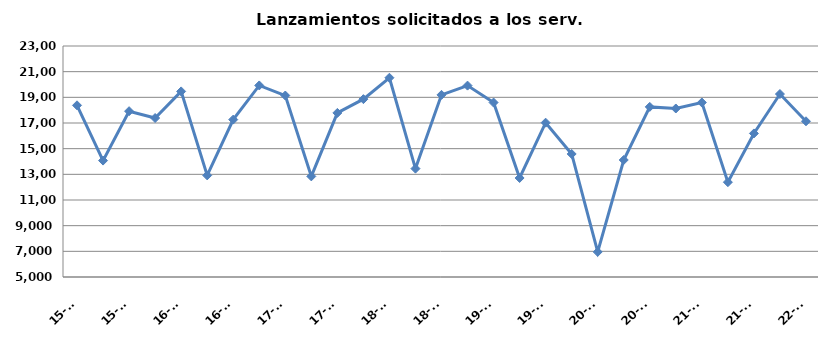
| Category | Lanzamientos solicitados a los Serv. comunes |
|---|---|
| 15-T2 | 18378 |
| 15-T3 | 14071 |
| 15-T4 | 17921 |
| 16-T1 | 17386 |
| 16-T2 | 19461 |
| 16-T3 | 12918 |
| 16-T4 | 17265 |
| 17-T1 | 19926 |
| 17-T2 | 19141 |
| 17-T3 | 12840 |
| 17-T4 | 17786 |
| 18-T1 | 18859 |
| 18-T2 | 20526 |
| 18-T3 | 13446 |
| 18-T4 | 19192 |
| 19-T1 | 19913 |
| 19-T2 | 18594 |
| 19-T3 | 12715 |
| 19-T4 | 17025 |
| 20-T1 | 14586 |
| 20-T2 | 6953 |
| 20-T3 | 14117 |
| 20-T4 | 18255 |
| 21-T1 | 18131 |
| 21-T2 | 18598 |
| 21-T3 | 12390 |
| 21-T4 | 16187 |
| 22-T1 | 19257 |
| 22-T2 | 17134 |